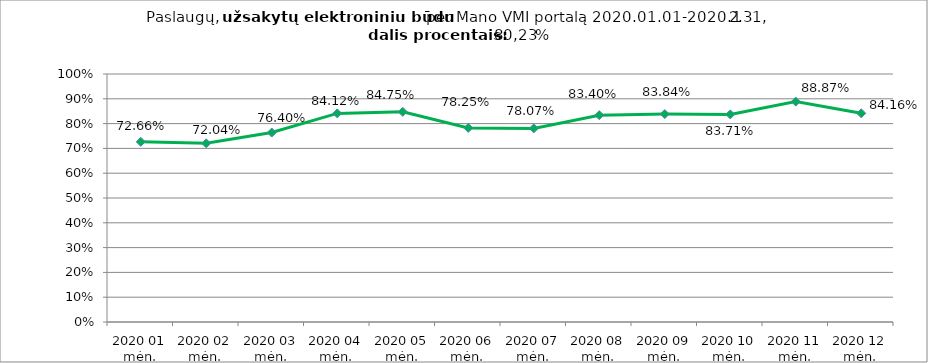
| Category | Elektroniniu būdu užsakytų paslaugų dalis procentais (lyginant su visomis  užsakytomis paslaugomis) |
|---|---|
| 2020 01 mėn. | 0.727 |
| 2020 02 mėn. | 0.72 |
| 2020 03 mėn. | 0.764 |
| 2020 04 mėn. | 0.841 |
| 2020 05 mėn. | 0.847 |
| 2020 06 mėn. | 0.782 |
| 2020 07 mėn. | 0.781 |
| 2020 08 mėn. | 0.834 |
| 2020 09 mėn. | 0.838 |
| 2020 10 mėn. | 0.837 |
| 2020 11 mėn. | 0.889 |
| 2020 12 mėn. | 0.842 |